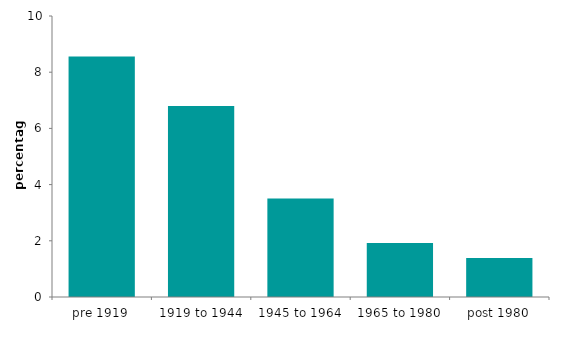
| Category | Series 0 |
|---|---|
| pre 1919 | 8.561 |
| 1919 to 1944 | 6.793 |
| 1945 to 1964 | 3.509 |
| 1965 to 1980 | 1.925 |
| post 1980 | 1.392 |